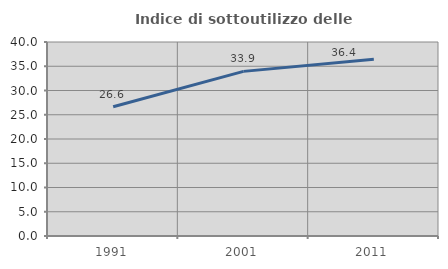
| Category | Indice di sottoutilizzo delle abitazioni  |
|---|---|
| 1991.0 | 26.647 |
| 2001.0 | 33.943 |
| 2011.0 | 36.421 |